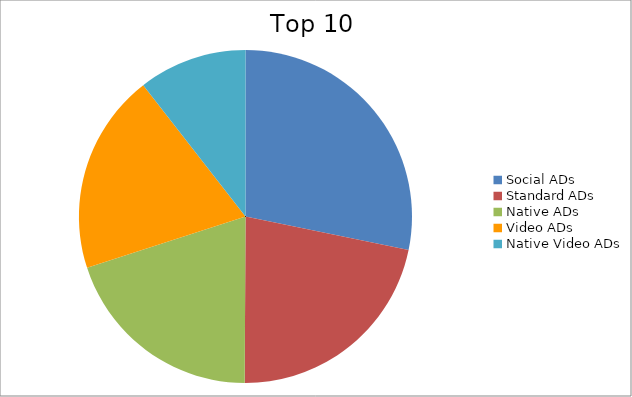
| Category | Series 0 |
|---|---|
| Social ADs | 28.23 |
| Standard ADs | 21.85 |
| Native ADs | 19.94 |
| Video ADs | 19.46 |
| Native Video ADs | 10.53 |